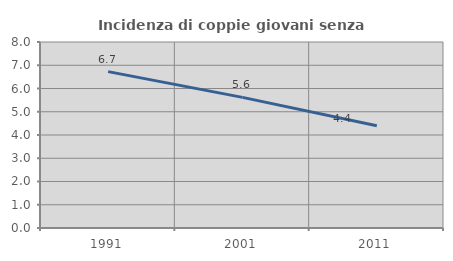
| Category | Incidenza di coppie giovani senza figli |
|---|---|
| 1991.0 | 6.726 |
| 2001.0 | 5.619 |
| 2011.0 | 4.397 |